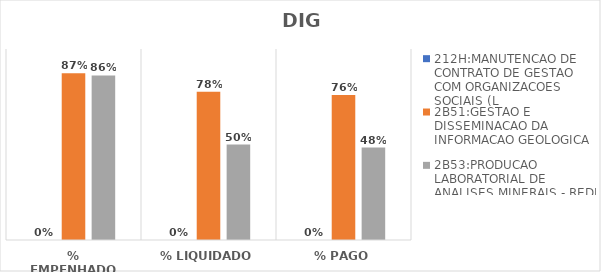
| Category | 212H:MANUTENCAO DE CONTRATO DE GESTAO COM ORGANIZACOES SOCIAIS (L | 2B51:GESTAO E DISSEMINACAO DA INFORMACAO GEOLOGICA | 2B53:PRODUCAO LABORATORIAL DE ANALISES MINERAIS - REDE LAMIN |
|---|---|---|---|
| % EMPENHADO | 0 | 0.873 | 0.861 |
| % LIQUIDADO | 0 | 0.776 | 0.5 |
| % PAGO | 0 | 0.76 | 0.484 |